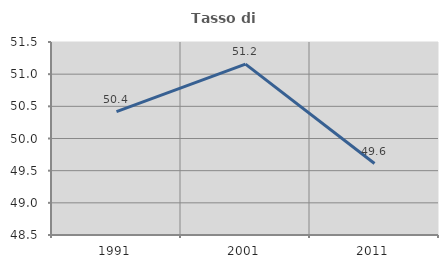
| Category | Tasso di occupazione   |
|---|---|
| 1991.0 | 50.419 |
| 2001.0 | 51.155 |
| 2011.0 | 49.611 |